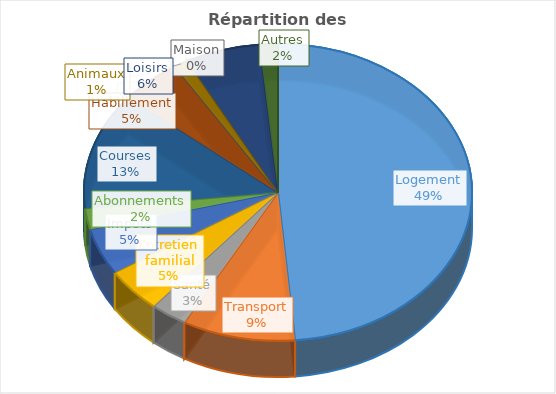
| Category | Series 0 | Series 1 |
|---|---|---|
| Logement |  | 1910 |
| Transport |  | 370 |
| Santé |  | 120 |
| Entretien familial |  | 190 |
| Impôts |  | 200 |
| Abonnements |  | 90 |
| Courses |  | 500 |
| Habillement |  | 200 |
| Maison |  | 0 |
| Animaux |  | 45 |
| Loisirs |  | 245 |
| Autres |  | 60 |